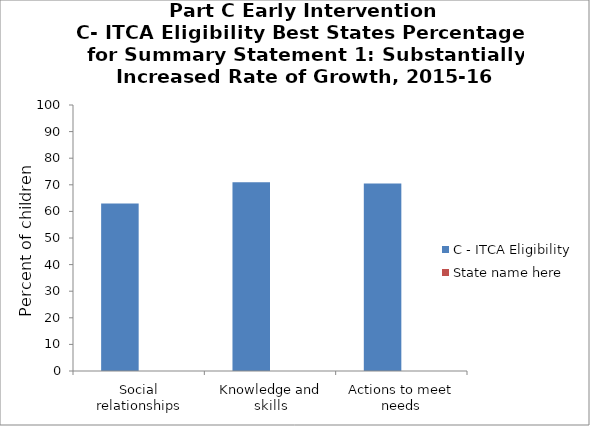
| Category | C - ITCA Eligibility | State name here |
|---|---|---|
| Social relationships | 63 |  |
| Knowledge and skills | 71 |  |
| Actions to meet needs | 70.5 |  |